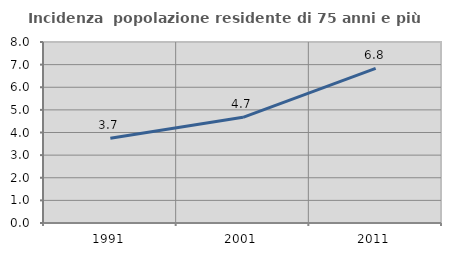
| Category | Incidenza  popolazione residente di 75 anni e più |
|---|---|
| 1991.0 | 3.744 |
| 2001.0 | 4.671 |
| 2011.0 | 6.837 |